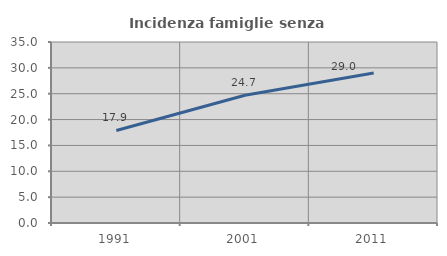
| Category | Incidenza famiglie senza nuclei |
|---|---|
| 1991.0 | 17.898 |
| 2001.0 | 24.711 |
| 2011.0 | 28.992 |